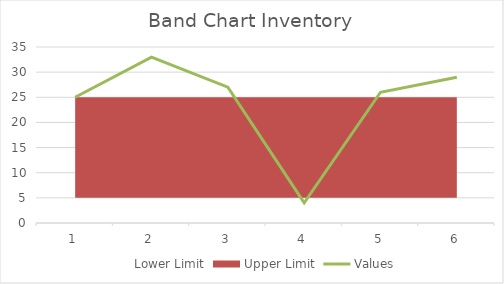
| Category | Values |
|---|---|
| 0 | 25 |
| 1 | 33 |
| 2 | 27 |
| 3 | 4 |
| 4 | 26 |
| 5 | 29 |